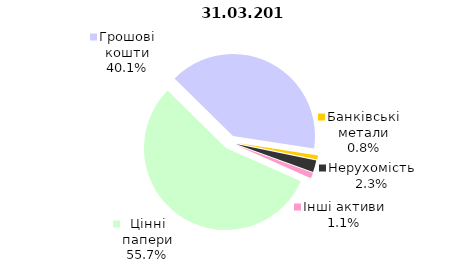
| Category | Всього |
|---|---|
| Цінні папери | 677.678 |
| Грошові кошти | 487.385 |
| Банківські метали | 9.746 |
| Нерухомість | 28.218 |
| Інші активи | 13.524 |